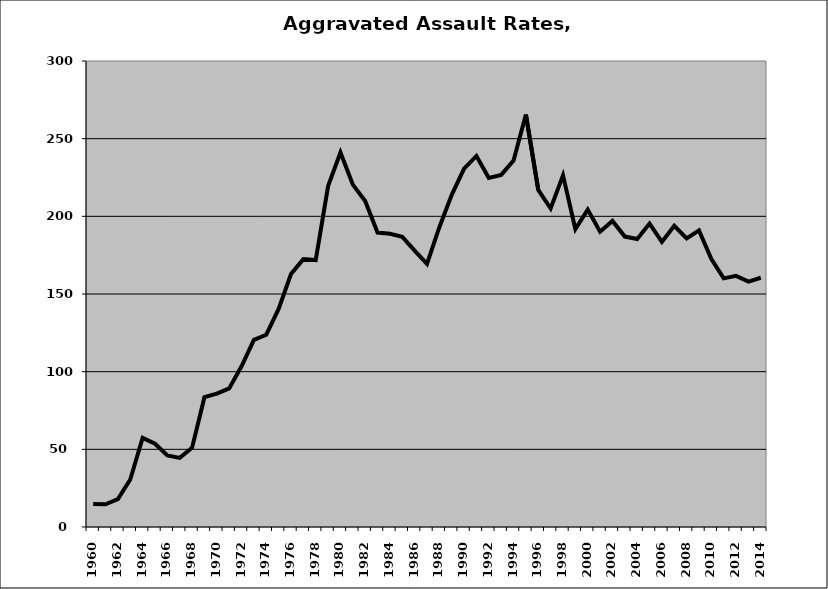
| Category | Aggravated Assault |
|---|---|
| 1960.0 | 14.838 |
| 1961.0 | 14.62 |
| 1962.0 | 17.908 |
| 1963.0 | 30.575 |
| 1964.0 | 57.37 |
| 1965.0 | 53.613 |
| 1966.0 | 46.11 |
| 1967.0 | 44.492 |
| 1968.0 | 51.064 |
| 1969.0 | 83.565 |
| 1970.0 | 85.834 |
| 1971.0 | 89.208 |
| 1972.0 | 103.439 |
| 1973.0 | 120.519 |
| 1974.0 | 123.78 |
| 1975.0 | 140.366 |
| 1976.0 | 162.816 |
| 1977.0 | 172.462 |
| 1978.0 | 171.868 |
| 1979.0 | 219.448 |
| 1980.0 | 241.091 |
| 1981.0 | 220.438 |
| 1982.0 | 209.845 |
| 1983.0 | 189.585 |
| 1984.0 | 188.811 |
| 1985.0 | 186.766 |
| 1986.0 | 177.966 |
| 1987.0 | 169.339 |
| 1988.0 | 192.993 |
| 1989.0 | 213.807 |
| 1990.0 | 230.743 |
| 1991.0 | 238.884 |
| 1992.0 | 224.742 |
| 1993.0 | 226.661 |
| 1994.0 | 235.922 |
| 1995.0 | 265.52 |
| 1996.0 | 216.989 |
| 1997.0 | 205.041 |
| 1998.0 | 226.363 |
| 1999.0 | 191.819 |
| 2000.0 | 204.335 |
| 2001.0 | 190.143 |
| 2002.0 | 197.003 |
| 2003.0 | 186.974 |
| 2004.0 | 185.358 |
| 2005.0 | 195.331 |
| 2006.0 | 183.571 |
| 2007.0 | 193.944 |
| 2008.0 | 185.728 |
| 2009.0 | 190.969 |
| 2010.0 | 172.559 |
| 2011.0 | 160.064 |
| 2012.0 | 161.696 |
| 2013.0 | 157.982 |
| 2014.0 | 160.481 |